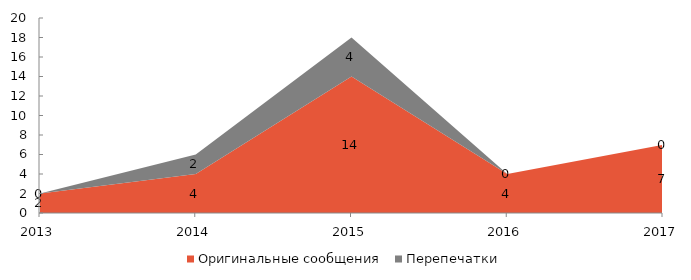
| Category | Оригинальные сообщения | Перепечатки |
|---|---|---|
| 2013 | 2 | 0 |
| 2014 | 4 | 2 |
| 2015 | 14 | 4 |
| 2016 | 4 | 0 |
| 2017 | 7 | 0 |